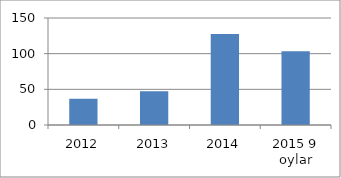
| Category | Series 0 |
|---|---|
| 2012 | 36.8 |
| 2013 | 47.3 |
| 2014 | 127.5 |
| 2015 9 oylar | 103.3 |